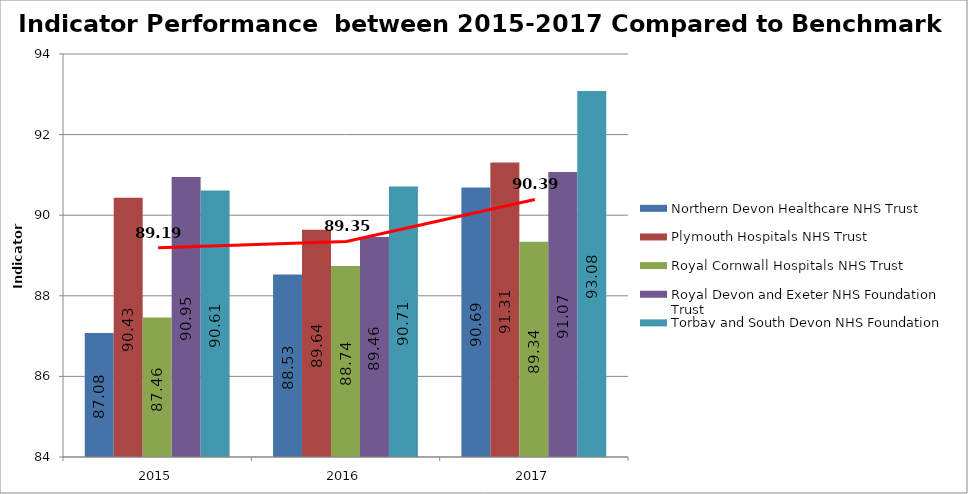
| Category | Northern Devon Healthcare NHS Trust | Plymouth Hospitals NHS Trust | Royal Cornwall Hospitals NHS Trust | Royal Devon and Exeter NHS Foundation Trust | Torbay and South Devon NHS Foundation Trust |
|---|---|---|---|---|---|
| 2015 | 87.08 | 90.43 | 87.46 | 90.95 | 90.61 |
| 2016 | 88.53 | 89.64 | 88.74 | 89.46 | 90.71 |
| 2017 | 90.69 | 91.31 | 89.34 | 91.07 | 93.08 |